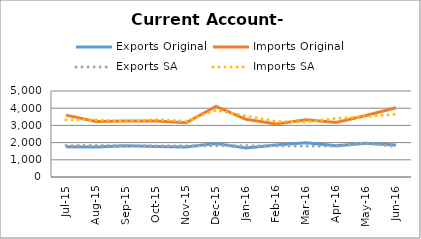
| Category | Exports Original | Imports Original | Exports SA | Imports SA |
|---|---|---|---|---|
| 2015-07-11 | 1759 | 3596 | 1833 | 3323 |
| 2015-08-11 | 1738 | 3222 | 1838 | 3325 |
| 2015-09-11 | 1821 | 3257 | 1828 | 3225 |
| 2015-10-11 | 1778 | 3254 | 1813 | 3348 |
| 2015-11-11 | 1740 | 3152 | 1816 | 3244 |
| 2015-12-11 | 1947 | 4101 | 1814 | 3887 |
| 2016-01-11 | 1692 | 3357 | 1823 | 3551 |
| 2016-02-11 | 1864 | 3086 | 1806 | 3233 |
| 2016-03-11 | 1989 | 3321 | 1796 | 3195 |
| 2016-04-11 | 1818 | 3168 | 1788 | 3407 |
| 2016-05-11 | 1959 | 3577 | 1953 | 3510 |
| 2016-06-11 | 1867 | 4027 | 1771 | 3651 |